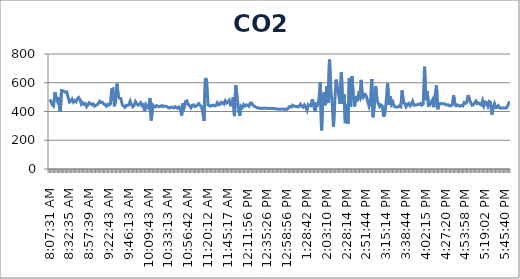
| Category | CO2 (ppm) |
|---|---|
| 0.3385532407407407 | 483 |
| 0.3396412037037037 | 469 |
| 0.3407291666666667 | 446 |
| 0.3418171296296297 | 438 |
| 0.34290509259259255 | 534 |
| 0.34399305555555554 | 491 |
| 0.3450810185185185 | 469 |
| 0.34616898148148145 | 500 |
| 0.34725694444444444 | 397 |
| 0.34943287037037035 | 546 |
| 0.35052083333333334 | 545 |
| 0.3516087962962963 | 540 |
| 0.3526967592592593 | 533 |
| 0.3537847222222222 | 536 |
| 0.35487268518518517 | 499 |
| 0.35596064814814815 | 465 |
| 0.3570486111111111 | 471 |
| 0.35813657407407407 | 486 |
| 0.35922453703703705 | 465 |
| 0.36031250000000004 | 476 |
| 0.36140046296296297 | 467 |
| 0.36248842592592595 | 487 |
| 0.3646643518518518 | 497 |
| 0.3657523148148148 | 482 |
| 0.3668402777777778 | 451 |
| 0.3679282407407407 | 462 |
| 0.3690162037037037 | 450 |
| 0.3701041666666667 | 455 |
| 0.37119212962962966 | 434 |
| 0.3722800925925926 | 446 |
| 0.3733680555555556 | 461 |
| 0.37445601851851856 | 454 |
| 0.37554398148148144 | 447 |
| 0.3766319444444444 | 453 |
| 0.3777199074074074 | 437 |
| 0.37880787037037034 | 443 |
| 0.3798958333333333 | 447 |
| 0.3809837962962963 | 457 |
| 0.3820717592592593 | 471 |
| 0.3831597222222222 | 462 |
| 0.3842476851851852 | 464 |
| 0.3853356481481482 | 452 |
| 0.38642361111111106 | 446 |
| 0.38751157407407405 | 437 |
| 0.38968749999999996 | 450 |
| 0.39077546296296295 | 445 |
| 0.39186342592592593 | 452 |
| 0.3929513888888889 | 553 |
| 0.39403935185185185 | 558 |
| 0.39512731481481483 | 436 |
| 0.3962152777777778 | 477 |
| 0.3973032407407407 | 594 |
| 0.3983912037037037 | 502 |
| 0.39947916666666666 | 492 |
| 0.40056712962962965 | 490 |
| 0.4016550925925926 | 447 |
| 0.40274305555555556 | 438 |
| 0.40383101851851855 | 429 |
| 0.4049189814814815 | 443 |
| 0.40600694444444446 | 442 |
| 0.40709490740740745 | 448 |
| 0.4081828703703703 | 472 |
| 0.4092708333333333 | 447 |
| 0.4103587962962963 | 433 |
| 0.4114467592592593 | 443 |
| 0.4125347222222222 | 469 |
| 0.4136226851851852 | 454 |
| 0.4147106481481482 | 444 |
| 0.4157986111111111 | 451 |
| 0.4168865740740741 | 461 |
| 0.4179745370370371 | 440 |
| 0.41906249999999995 | 447 |
| 0.42015046296296293 | 403 |
| 0.4212384259259259 | 447 |
| 0.4223263888888889 | 433 |
| 0.42341435185185183 | 423 |
| 0.4245023148148148 | 494 |
| 0.4255902777777778 | 338 |
| 0.42667824074074073 | 446 |
| 0.4277662037037037 | 436 |
| 0.4288541666666667 | 431 |
| 0.4299421296296296 | 441 |
| 0.43103009259259256 | 437 |
| 0.43211805555555555 | 433 |
| 0.43320601851851853 | 436 |
| 0.43429398148148146 | 442 |
| 0.43538194444444445 | 434 |
| 0.43646990740740743 | 437 |
| 0.43755787037037036 | 436 |
| 0.43864583333333335 | 434 |
| 0.43973379629629633 | 426 |
| 0.4408217592592592 | 424 |
| 0.4419097222222222 | 431 |
| 0.4429976851851852 | 428 |
| 0.44408564814814816 | 425 |
| 0.4451736111111111 | 434 |
| 0.4462615740740741 | 427 |
| 0.44734953703703706 | 422 |
| 0.4484375 | 431 |
| 0.449525462962963 | 421 |
| 0.4506018518518518 | 372 |
| 0.4516898148148148 | 458 |
| 0.4527777777777778 | 431 |
| 0.4538657407407407 | 470 |
| 0.4549537037037037 | 474 |
| 0.4560416666666667 | 448 |
| 0.45712962962962966 | 441 |
| 0.4582175925925926 | 426 |
| 0.4593055555555556 | 442 |
| 0.46039351851851856 | 446 |
| 0.46148148148148144 | 434 |
| 0.4625694444444444 | 437 |
| 0.4636574074074074 | 448 |
| 0.46474537037037034 | 455 |
| 0.4658333333333333 | 442 |
| 0.4669212962962963 | 436 |
| 0.4680092592592593 | 393 |
| 0.4690972222222222 | 334 |
| 0.4701851851851852 | 632 |
| 0.4712731481481482 | 614 |
| 0.47236111111111106 | 445 |
| 0.47344907407407405 | 441 |
| 0.47453703703703703 | 437 |
| 0.47562499999999996 | 443 |
| 0.47671296296296295 | 444 |
| 0.47780092592592593 | 439 |
| 0.4788888888888889 | 442 |
| 0.47997685185185185 | 461 |
| 0.4821527777777778 | 447 |
| 0.4832407407407407 | 449 |
| 0.4843287037037037 | 464 |
| 0.48541666666666666 | 461 |
| 0.4865162037037037 | 452 |
| 0.48760416666666667 | 474 |
| 0.4886921296296296 | 459 |
| 0.4897800925925926 | 466 |
| 0.49086805555555557 | 478 |
| 0.4919560185185185 | 446 |
| 0.4930439814814815 | 446 |
| 0.49413194444444447 | 500 |
| 0.4952314814814815 | 368 |
| 0.4963194444444445 | 582 |
| 0.49740740740740735 | 497 |
| 0.49849537037037034 | 423 |
| 0.4995833333333333 | 370 |
| 0.5006712962962964 | 437 |
| 0.5039351851851852 | 428 |
| 0.5050231481481481 | 448 |
| 0.5061111111111111 | 438 |
| 0.507199074074074 | 446 |
| 0.508287037037037 | 444 |
| 0.509375 | 436 |
| 0.510462962962963 | 459 |
| 0.511550925925926 | 459 |
| 0.5126388888888889 | 443 |
| 0.5137268518518519 | 438 |
| 0.5148148148148148 | 432 |
| 0.5159027777777777 | 427 |
| 0.5169907407407407 | 425 |
| 0.5180787037037037 | 423 |
| 0.5191666666666667 | 421 |
| 0.5202546296296297 | 423 |
| 0.5213425925925926 | 423 |
| 0.5224305555555556 | 423 |
| 0.5235185185185185 | 424 |
| 0.5246064814814815 | 421 |
| 0.5256944444444445 | 422 |
| 0.5267824074074073 | 421 |
| 0.5278703703703703 | 422 |
| 0.5289583333333333 | 421 |
| 0.5300462962962963 | 421 |
| 0.5311342592592593 | 419 |
| 0.5322222222222223 | 417 |
| 0.5333101851851852 | 417 |
| 0.5343981481481481 | 416 |
| 0.5354861111111111 | 416 |
| 0.5365740740740741 | 417 |
| 0.537662037037037 | 417 |
| 0.53875 | 415 |
| 0.5398379629629629 | 416 |
| 0.5409259259259259 | 416 |
| 0.5420138888888889 | 428 |
| 0.5431018518518519 | 435 |
| 0.5441898148148149 | 431 |
| 0.5452777777777778 | 444 |
| 0.5463657407407407 | 438 |
| 0.5474537037037037 | 436 |
| 0.5485416666666666 | 435 |
| 0.5496296296296296 | 431 |
| 0.5507175925925926 | 437 |
| 0.5518055555555555 | 450 |
| 0.5528935185185185 | 436 |
| 0.5539814814814815 | 430 |
| 0.5572453703703704 | 446 |
| 0.5605092592592592 | 432 |
| 0.5615972222222222 | 409 |
| 0.5626851851851852 | 448 |
| 0.5659490740740741 | 443 |
| 0.567037037037037 | 440 |
| 0.568125 | 486 |
| 0.569212962962963 | 443 |
| 0.570300925925926 | 397 |
| 0.5724768518518518 | 451 |
| 0.5735648148148148 | 446 |
| 0.5790046296296296 | 485 |
| 0.5800925925925926 | 604 |
| 0.5811805555555556 | 269 |
| 0.5822685185185185 | 492 |
| 0.5833564814814814 | 536 |
| 0.5844444444444444 | 444 |
| 0.5855324074074074 | 577 |
| 0.5866203703703704 | 461 |
| 0.5877083333333334 | 761 |
| 0.5887962962962963 | 552 |
| 0.5898842592592592 | 462 |
| 0.5909722222222222 | 294 |
| 0.5931481481481481 | 472 |
| 0.5942361111111111 | 622 |
| 0.5953240740740741 | 562 |
| 0.596412037037037 | 512 |
| 0.5975 | 454 |
| 0.598587962962963 | 671 |
| 0.599675925925926 | 452 |
| 0.6007638888888889 | 522 |
| 0.6018518518518519 | 319 |
| 0.6029398148148148 | 453 |
| 0.6040277777777777 | 316 |
| 0.6051157407407407 | 630 |
| 0.6062037037037037 | 433 |
| 0.6072916666666667 | 645 |
| 0.6083796296296297 | 510 |
| 0.6094675925925926 | 435 |
| 0.6105555555555556 | 508 |
| 0.6116435185185185 | 471 |
| 0.6127314814814815 | 518 |
| 0.6138194444444445 | 499 |
| 0.6149074074074073 | 620 |
| 0.6159953703703703 | 486 |
| 0.6170833333333333 | 519 |
| 0.6181712962962963 | 520 |
| 0.6192592592592593 | 505 |
| 0.6203472222222223 | 467 |
| 0.6214351851851853 | 436 |
| 0.6225231481481481 | 470 |
| 0.6236111111111111 | 626 |
| 0.6246990740740741 | 360 |
| 0.625787037037037 | 452 |
| 0.626875 | 575 |
| 0.627962962962963 | 482 |
| 0.6290509259259259 | 454 |
| 0.6301388888888889 | 434 |
| 0.6312268518518519 | 446 |
| 0.6323148148148149 | 438 |
| 0.6334027777777778 | 364 |
| 0.6344907407407407 | 386 |
| 0.6355787037037037 | 476 |
| 0.6366666666666666 | 597 |
| 0.6377546296296296 | 448 |
| 0.6388425925925926 | 507 |
| 0.6399305555555556 | 450 |
| 0.6410185185185185 | 466 |
| 0.6421064814814815 | 436 |
| 0.6431944444444445 | 431 |
| 0.6442824074074074 | 431 |
| 0.6453703703703704 | 431 |
| 0.6464583333333334 | 440 |
| 0.6475462962962962 | 434 |
| 0.6486342592592592 | 547 |
| 0.6497222222222222 | 462 |
| 0.6508101851851852 | 458 |
| 0.6518981481481482 | 434 |
| 0.6529861111111112 | 450 |
| 0.6540740740740741 | 456 |
| 0.655162037037037 | 440 |
| 0.65625 | 451 |
| 0.657337962962963 | 471 |
| 0.6584259259259259 | 444 |
| 0.6595138888888888 | 445 |
| 0.6606018518518518 | 446 |
| 0.6616898148148148 | 451 |
| 0.6627777777777778 | 449 |
| 0.6638657407407408 | 455 |
| 0.6649537037037038 | 444 |
| 0.6660416666666666 | 453 |
| 0.6671296296296297 | 711 |
| 0.6682291666666668 | 479 |
| 0.6693171296296296 | 543 |
| 0.6704050925925925 | 442 |
| 0.6714930555555556 | 444 |
| 0.6725810185185185 | 464 |
| 0.6736805555555555 | 481 |
| 0.6747685185185185 | 430 |
| 0.6769444444444445 | 509 |
| 0.6780324074074073 | 581 |
| 0.6791203703703704 | 416 |
| 0.6802083333333333 | 452 |
| 0.6812962962962964 | 456 |
| 0.6823842592592593 | 454 |
| 0.6834722222222221 | 453 |
| 0.6845601851851852 | 454 |
| 0.6856481481481481 | 448 |
| 0.6878240740740741 | 445 |
| 0.6889120370370371 | 447 |
| 0.69 | 439 |
| 0.691087962962963 | 440 |
| 0.6921759259259259 | 446 |
| 0.6943518518518519 | 513 |
| 0.6954398148148148 | 452 |
| 0.6965277777777777 | 440 |
| 0.6976157407407407 | 446 |
| 0.6987037037037037 | 439 |
| 0.6997916666666667 | 437 |
| 0.7008796296296297 | 443 |
| 0.7019675925925926 | 439 |
| 0.7030555555555557 | 462 |
| 0.7041435185185185 | 456 |
| 0.7052314814814814 | 465 |
| 0.7074074074074074 | 514 |
| 0.7084953703703704 | 484 |
| 0.7095833333333333 | 461 |
| 0.7106712962962963 | 443 |
| 0.7117592592592592 | 447 |
| 0.7128472222222223 | 460 |
| 0.7139351851851852 | 473 |
| 0.715023148148148 | 455 |
| 0.7161111111111111 | 459 |
| 0.717199074074074 | 451 |
| 0.718287037037037 | 446 |
| 0.719375 | 476 |
| 0.720462962962963 | 440 |
| 0.721550925925926 | 466 |
| 0.7226388888888889 | 462 |
| 0.7237268518518518 | 437 |
| 0.7269907407407407 | 469 |
| 0.7280787037037038 | 463 |
| 0.7291666666666666 | 379 |
| 0.7302546296296296 | 430 |
| 0.7313425925925926 | 455 |
| 0.7324305555555556 | 428 |
| 0.7335185185185185 | 428 |
| 0.7346064814814816 | 440 |
| 0.7356944444444444 | 425 |
| 0.7367824074074073 | 423 |
| 0.7378703703703704 | 425 |
| 0.7389583333333333 | 424 |
| 0.7400462962962964 | 424 |
| 0.7411342592592592 | 425 |
| 0.7422222222222222 | 440 |
| 0.7433101851851852 | 461 |
| 0.7443981481481482 | 463 |